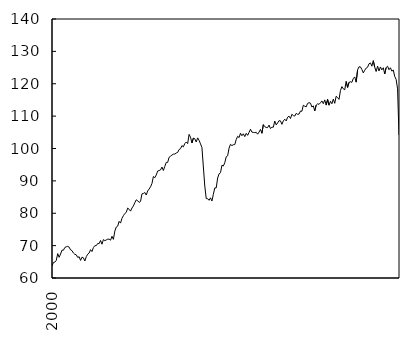
| Category | Indice mensuel |
|---|---|
| 2000-01-01 | 63.723 |
| 2000-02-01 | 64.804 |
| 2000-03-01 | 64.898 |
| 2000-04-01 | 65.453 |
| 2000-05-01 | 67.53 |
| 2000-06-01 | 66.389 |
| 2000-07-01 | 67.415 |
| 2000-08-01 | 68.596 |
| 2000-09-01 | 68.586 |
| 2000-10-01 | 69.432 |
| 2000-11-01 | 69.641 |
| 2000-12-01 | 69.774 |
| 2001-01-01 | 69.531 |
| 2001-02-01 | 68.689 |
| 2001-03-01 | 68.452 |
| 2001-04-01 | 67.714 |
| 2001-05-01 | 67.303 |
| 2001-06-01 | 67.161 |
| 2001-07-01 | 66.347 |
| 2001-08-01 | 66.56 |
| 2001-09-01 | 65.438 |
| 2001-10-01 | 66.444 |
| 2001-11-01 | 66.229 |
| 2001-12-01 | 65.262 |
| 2002-01-01 | 66.57 |
| 2002-02-01 | 67.347 |
| 2002-03-01 | 67.712 |
| 2002-04-01 | 68.753 |
| 2002-05-01 | 68.164 |
| 2002-06-01 | 69.411 |
| 2002-07-01 | 69.979 |
| 2002-08-01 | 69.999 |
| 2002-09-01 | 70.666 |
| 2002-10-01 | 70.6 |
| 2002-11-01 | 71.59 |
| 2002-12-01 | 70.438 |
| 2003-01-01 | 71.862 |
| 2003-02-01 | 71.543 |
| 2003-03-01 | 71.754 |
| 2003-04-01 | 71.989 |
| 2003-05-01 | 72 |
| 2003-06-01 | 71.68 |
| 2003-07-01 | 72.878 |
| 2003-08-01 | 71.932 |
| 2003-09-01 | 74.493 |
| 2003-10-01 | 75.747 |
| 2003-11-01 | 76.01 |
| 2003-12-01 | 77.49 |
| 2004-01-01 | 76.959 |
| 2004-02-01 | 78.438 |
| 2004-03-01 | 79.252 |
| 2004-04-01 | 79.916 |
| 2004-05-01 | 80.261 |
| 2004-06-01 | 81.592 |
| 2004-07-01 | 81.218 |
| 2004-08-01 | 80.656 |
| 2004-09-01 | 81.629 |
| 2004-10-01 | 82.252 |
| 2004-11-01 | 83.259 |
| 2004-12-01 | 84.148 |
| 2005-01-01 | 83.874 |
| 2005-02-01 | 83.351 |
| 2005-03-01 | 83.661 |
| 2005-04-01 | 85.984 |
| 2005-05-01 | 86.108 |
| 2005-06-01 | 86.408 |
| 2005-07-01 | 85.623 |
| 2005-08-01 | 86.895 |
| 2005-09-01 | 87.478 |
| 2005-10-01 | 88.158 |
| 2005-11-01 | 89.178 |
| 2005-12-01 | 91.345 |
| 2006-01-01 | 90.985 |
| 2006-02-01 | 91.824 |
| 2006-03-01 | 93.023 |
| 2006-04-01 | 93.192 |
| 2006-05-01 | 93.383 |
| 2006-06-01 | 94.272 |
| 2006-07-01 | 93.204 |
| 2006-08-01 | 94.486 |
| 2006-09-01 | 95.704 |
| 2006-10-01 | 95.701 |
| 2006-11-01 | 97.3 |
| 2006-12-01 | 97.602 |
| 2007-01-01 | 97.974 |
| 2007-02-01 | 98.255 |
| 2007-03-01 | 98.271 |
| 2007-04-01 | 98.609 |
| 2007-05-01 | 98.792 |
| 2007-06-01 | 99.692 |
| 2007-07-01 | 99.929 |
| 2007-08-01 | 100.889 |
| 2007-09-01 | 100.514 |
| 2007-10-01 | 101.518 |
| 2007-11-01 | 101.995 |
| 2007-12-01 | 101.501 |
| 2008-01-01 | 104.358 |
| 2008-02-01 | 103.503 |
| 2008-03-01 | 101.7 |
| 2008-04-01 | 103.214 |
| 2008-05-01 | 103.019 |
| 2008-06-01 | 102.01 |
| 2008-07-01 | 103.286 |
| 2008-08-01 | 102.523 |
| 2008-09-01 | 101.441 |
| 2008-10-01 | 100.308 |
| 2008-11-01 | 94.289 |
| 2008-12-01 | 88.403 |
| 2009-01-01 | 84.523 |
| 2009-02-01 | 84.492 |
| 2009-03-01 | 84.003 |
| 2009-04-01 | 84.766 |
| 2009-05-01 | 83.773 |
| 2009-06-01 | 85.864 |
| 2009-07-01 | 87.831 |
| 2009-08-01 | 87.829 |
| 2009-09-01 | 90.875 |
| 2009-10-01 | 92.166 |
| 2009-11-01 | 92.53 |
| 2009-12-01 | 94.825 |
| 2010-01-01 | 94.587 |
| 2010-02-01 | 95.617 |
| 2010-03-01 | 97.439 |
| 2010-04-01 | 97.749 |
| 2010-05-01 | 100.113 |
| 2010-06-01 | 101.301 |
| 2010-07-01 | 100.899 |
| 2010-08-01 | 101.174 |
| 2010-09-01 | 101.209 |
| 2010-10-01 | 102.771 |
| 2010-11-01 | 103.766 |
| 2010-12-01 | 103.373 |
| 2011-01-01 | 104.721 |
| 2011-02-01 | 103.951 |
| 2011-03-01 | 104.54 |
| 2011-04-01 | 103.666 |
| 2011-05-01 | 104.672 |
| 2011-06-01 | 104.073 |
| 2011-07-01 | 104.973 |
| 2011-08-01 | 105.939 |
| 2011-09-01 | 105.064 |
| 2011-10-01 | 104.957 |
| 2011-11-01 | 104.908 |
| 2011-12-01 | 105.011 |
| 2012-01-01 | 104.416 |
| 2012-02-01 | 105.066 |
| 2012-03-01 | 105.898 |
| 2012-04-01 | 104.696 |
| 2012-05-01 | 107.371 |
| 2012-06-01 | 106.753 |
| 2012-07-01 | 106.49 |
| 2012-08-01 | 106.459 |
| 2012-09-01 | 107.239 |
| 2012-10-01 | 106.145 |
| 2012-11-01 | 106.583 |
| 2012-12-01 | 106.584 |
| 2013-01-01 | 108.482 |
| 2013-02-01 | 107.288 |
| 2013-03-01 | 107.887 |
| 2013-04-01 | 108.602 |
| 2013-05-01 | 108.531 |
| 2013-06-01 | 107.463 |
| 2013-07-01 | 108.537 |
| 2013-08-01 | 109.045 |
| 2013-09-01 | 108.515 |
| 2013-10-01 | 109.675 |
| 2013-11-01 | 109.993 |
| 2013-12-01 | 109.255 |
| 2014-01-01 | 110.576 |
| 2014-02-01 | 110.161 |
| 2014-03-01 | 110.017 |
| 2014-04-01 | 110.852 |
| 2014-05-01 | 110.542 |
| 2014-06-01 | 110.626 |
| 2014-07-01 | 111.58 |
| 2014-08-01 | 111.497 |
| 2014-09-01 | 113.372 |
| 2014-10-01 | 113.064 |
| 2014-11-01 | 112.857 |
| 2014-12-01 | 113.933 |
| 2015-01-01 | 114.149 |
| 2015-02-01 | 114.006 |
| 2015-03-01 | 112.811 |
| 2015-04-01 | 113.177 |
| 2015-05-01 | 111.611 |
| 2015-06-01 | 113.4 |
| 2015-07-01 | 113.794 |
| 2015-08-01 | 113.634 |
| 2015-09-01 | 114.139 |
| 2015-10-01 | 114.694 |
| 2015-11-01 | 113.843 |
| 2015-12-01 | 115.014 |
| 2016-01-01 | 113.408 |
| 2016-02-01 | 115.15 |
| 2016-03-01 | 113.374 |
| 2016-04-01 | 114.586 |
| 2016-05-01 | 113.817 |
| 2016-06-01 | 115.267 |
| 2016-07-01 | 113.957 |
| 2016-08-01 | 116.135 |
| 2016-09-01 | 115.734 |
| 2016-10-01 | 115.176 |
| 2016-11-01 | 117.901 |
| 2016-12-01 | 119.115 |
| 2017-01-01 | 118.43 |
| 2017-02-01 | 118.146 |
| 2017-03-01 | 120.7 |
| 2017-04-01 | 118.873 |
| 2017-05-01 | 120.423 |
| 2017-06-01 | 120.622 |
| 2017-07-01 | 120.437 |
| 2017-08-01 | 121.616 |
| 2017-09-01 | 122.109 |
| 2017-10-01 | 120.501 |
| 2017-11-01 | 124.287 |
| 2017-12-01 | 125.241 |
| 2018-01-01 | 125.213 |
| 2018-02-01 | 124.41 |
| 2018-03-01 | 123.348 |
| 2018-04-01 | 124.172 |
| 2018-05-01 | 124.845 |
| 2018-06-01 | 125.107 |
| 2018-07-01 | 126.165 |
| 2018-08-01 | 126.437 |
| 2018-09-01 | 125.423 |
| 2018-10-01 | 127.137 |
| 2018-11-01 | 125.103 |
| 2018-12-01 | 123.786 |
| 2019-01-01 | 125.445 |
| 2019-02-01 | 123.954 |
| 2019-03-01 | 125.184 |
| 2019-04-01 | 124.29 |
| 2019-05-01 | 124.943 |
| 2019-06-01 | 123.017 |
| 2019-07-01 | 124.997 |
| 2019-08-01 | 125.406 |
| 2019-09-01 | 124.342 |
| 2019-10-01 | 124.939 |
| 2019-11-01 | 123.896 |
| 2019-12-01 | 124.24 |
| 2020-01-01 | 122.28 |
| 2020-02-01 | 121.331 |
| 2020-03-01 | 118.422 |
| 2020-04-01 | 104.151 |